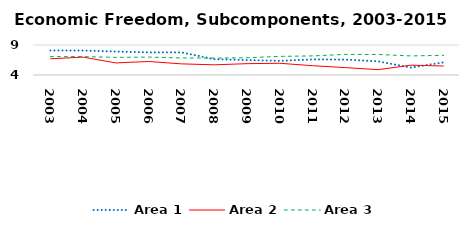
| Category | Area 1 | Area 2 | Area 3 |
|---|---|---|---|
| 2003.0 | 8.082 | 6.7 | 7.062 |
| 2004.0 | 8.08 | 6.974 | 7.065 |
| 2005.0 | 7.913 | 6.013 | 6.936 |
| 2006.0 | 7.765 | 6.251 | 6.986 |
| 2007.0 | 7.774 | 5.856 | 6.84 |
| 2008.0 | 6.635 | 5.696 | 6.814 |
| 2009.0 | 6.483 | 5.889 | 6.876 |
| 2010.0 | 6.357 | 5.955 | 7.103 |
| 2011.0 | 6.595 | 5.548 | 7.184 |
| 2012.0 | 6.567 | 5.235 | 7.433 |
| 2013.0 | 6.27 | 4.889 | 7.42 |
| 2014.0 | 5.237 | 5.636 | 7.18 |
| 2015.0 | 6.104 | 5.495 | 7.28 |